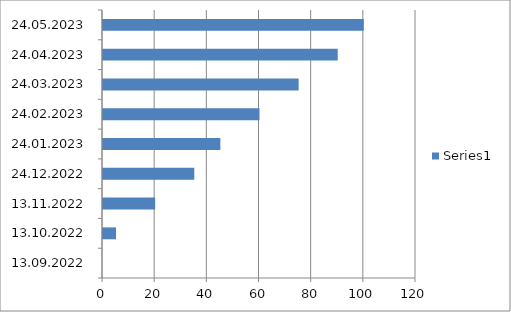
| Category | Series 0 |
|---|---|
| 13.09.2022 | 0 |
| 13.10.2022 | 5 |
| 13.11.2022 | 20 |
| 24.12.2022 | 35 |
| 24.01.2023 | 45 |
| 24.02.2023 | 60 |
| 24.03.2023 | 75 |
| 24.04.2023 | 90 |
| 24.05.2023 | 100 |